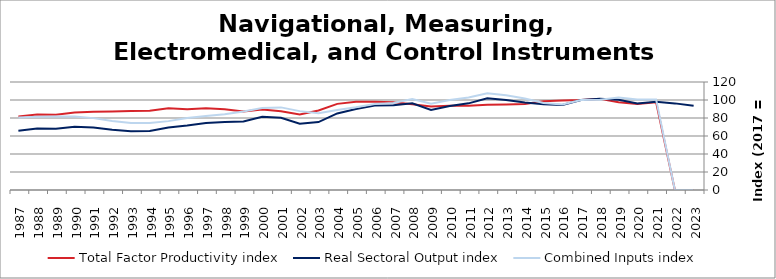
| Category | Total Factor Productivity index | Real Sectoral Output index | Combined Inputs index |
|---|---|---|---|
| 2023.0 | 0 | 93.645 | 0 |
| 2022.0 | 0 | 96.246 | 0 |
| 2021.0 | 97.379 | 97.976 | 100.613 |
| 2020.0 | 95.635 | 96.23 | 100.622 |
| 2019.0 | 97.554 | 100.258 | 102.772 |
| 2018.0 | 101.241 | 101.422 | 100.179 |
| 2017.0 | 100 | 100 | 100 |
| 2016.0 | 99.412 | 94.475 | 95.034 |
| 2015.0 | 98.553 | 95.289 | 96.688 |
| 2014.0 | 95.473 | 97.135 | 101.741 |
| 2013.0 | 95.034 | 100 | 105.226 |
| 2012.0 | 94.743 | 101.846 | 107.497 |
| 2011.0 | 93.557 | 96.269 | 102.898 |
| 2010.0 | 93.495 | 93.433 | 99.933 |
| 2009.0 | 92.872 | 88.915 | 95.74 |
| 2008.0 | 95.357 | 96.393 | 101.086 |
| 2007.0 | 97.426 | 94.3 | 96.791 |
| 2006.0 | 98.07 | 93.762 | 95.607 |
| 2005.0 | 98.032 | 90.035 | 91.842 |
| 2004.0 | 95.707 | 85.068 | 88.884 |
| 2003.0 | 88.418 | 75.457 | 85.342 |
| 2002.0 | 84.01 | 73.625 | 87.637 |
| 2001.0 | 87.398 | 80.23 | 91.798 |
| 2000.0 | 89.465 | 81.404 | 90.989 |
| 1999.0 | 87.211 | 76.07 | 87.225 |
| 1998.0 | 89.763 | 75.549 | 84.165 |
| 1997.0 | 90.742 | 74.548 | 82.153 |
| 1996.0 | 89.637 | 71.77 | 80.068 |
| 1995.0 | 90.889 | 69.56 | 76.532 |
| 1994.0 | 88.075 | 65.527 | 74.4 |
| 1993.0 | 87.685 | 65.383 | 74.566 |
| 1992.0 | 87.268 | 66.909 | 76.671 |
| 1991.0 | 87.017 | 69.49 | 79.857 |
| 1990.0 | 86.058 | 70.294 | 81.682 |
| 1989.0 | 83.481 | 68.073 | 81.543 |
| 1988.0 | 83.757 | 68.212 | 81.441 |
| 1987.0 | 81.755 | 65.895 | 80.601 |